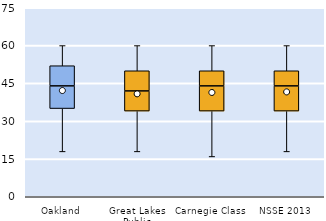
| Category | 25th | 50th | 75th |
|---|---|---|---|
| Oakland | 35 | 9 | 8 |
| Great Lakes Public | 34 | 8 | 8 |
| Carnegie Class | 34 | 10 | 6 |
| NSSE 2013 | 34 | 10 | 6 |